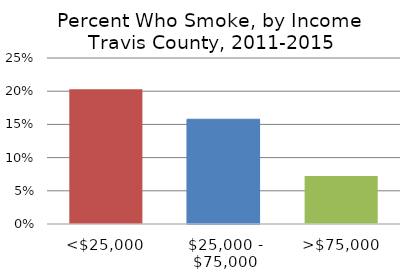
| Category | Series 0 |
|---|---|
| <$25,000 | 0.203 |
| $25,000 - $75,000 | 0.158 |
| >$75,000 | 0.072 |